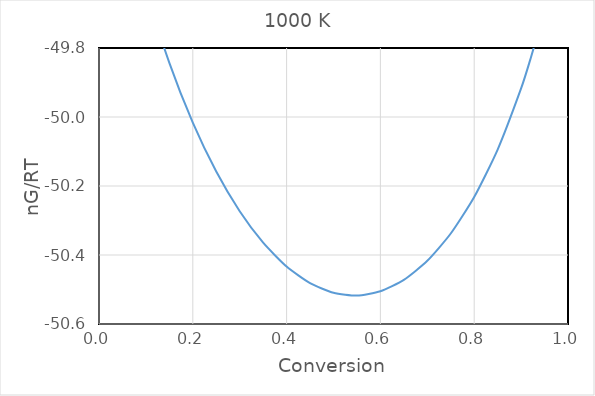
| Category | Series 0 |
|---|---|
| 0.05 | -49.359 |
| 0.1 | -49.63 |
| 0.15 | -49.843 |
| 0.2 | -50.016 |
| 0.25 | -50.158 |
| 0.3 | -50.273 |
| 0.35 | -50.364 |
| 0.4 | -50.433 |
| 0.45 | -50.482 |
| 0.5 | -50.51 |
| 0.55 | -50.518 |
| 0.6 | -50.505 |
| 0.65 | -50.472 |
| 0.7 | -50.417 |
| 0.75 | -50.338 |
| 0.8 | -50.232 |
| 0.85 | -50.094 |
| 0.9 | -49.917 |
| 0.92 | -49.832 |
| 0.94 | -49.735 |
| 0.97 | -49.562 |
| 0.99 | -49.411 |
| 0.995 | -49.364 |